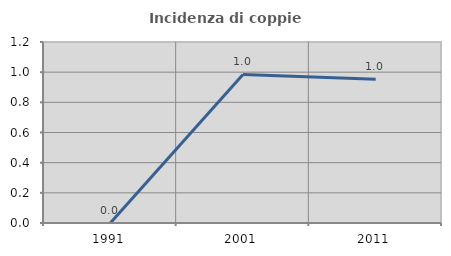
| Category | Incidenza di coppie miste |
|---|---|
| 1991.0 | 0 |
| 2001.0 | 0.985 |
| 2011.0 | 0.952 |